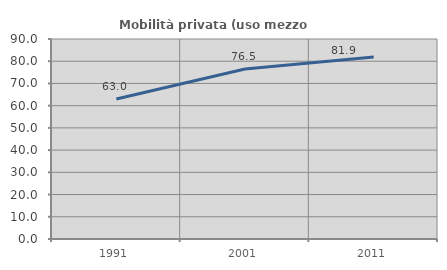
| Category | Mobilità privata (uso mezzo privato) |
|---|---|
| 1991.0 | 62.963 |
| 2001.0 | 76.522 |
| 2011.0 | 81.89 |